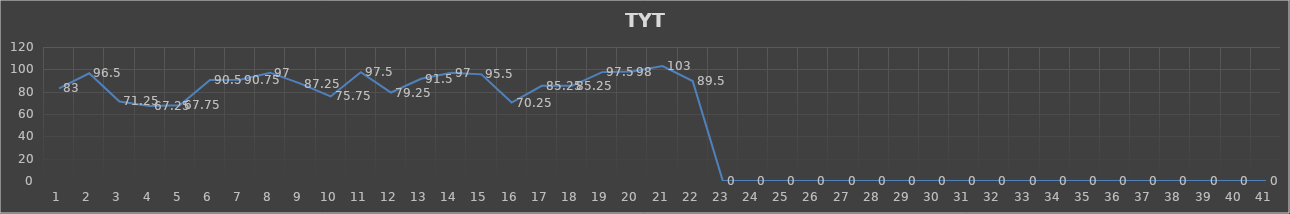
| Category | Series 0 |
|---|---|
| 0 | 83 |
| 1 | 96.5 |
| 2 | 71.25 |
| 3 | 67.25 |
| 4 | 67.75 |
| 5 | 90.5 |
| 6 | 90.75 |
| 7 | 97 |
| 8 | 87.25 |
| 9 | 75.75 |
| 10 | 97.5 |
| 11 | 79.25 |
| 12 | 91.5 |
| 13 | 97 |
| 14 | 95.5 |
| 15 | 70.25 |
| 16 | 85.25 |
| 17 | 85.25 |
| 18 | 97.5 |
| 19 | 98 |
| 20 | 103 |
| 21 | 89.5 |
| 22 | 0 |
| 23 | 0 |
| 24 | 0 |
| 25 | 0 |
| 26 | 0 |
| 27 | 0 |
| 28 | 0 |
| 29 | 0 |
| 30 | 0 |
| 31 | 0 |
| 32 | 0 |
| 33 | 0 |
| 34 | 0 |
| 35 | 0 |
| 36 | 0 |
| 37 | 0 |
| 38 | 0 |
| 39 | 0 |
| 40 | 0 |